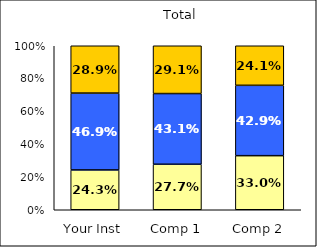
| Category | Low Social Agency | Average Social Agency | High Social Agency |
|---|---|---|---|
| Your Inst | 0.243 | 0.469 | 0.289 |
| Comp 1 | 0.277 | 0.431 | 0.291 |
| Comp 2 | 0.33 | 0.429 | 0.241 |